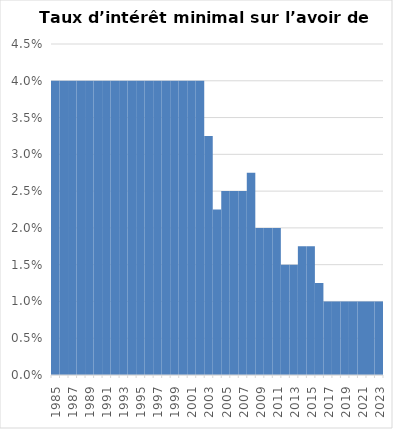
| Category | Taux d’intérêt minimal sur l’avoir de vieillesse |
|---|---|
| 1985.0 | 0.04 |
| 1986.0 | 0.04 |
| 1987.0 | 0.04 |
| 1988.0 | 0.04 |
| 1989.0 | 0.04 |
| 1990.0 | 0.04 |
| 1991.0 | 0.04 |
| 1992.0 | 0.04 |
| 1993.0 | 0.04 |
| 1994.0 | 0.04 |
| 1995.0 | 0.04 |
| 1996.0 | 0.04 |
| 1997.0 | 0.04 |
| 1998.0 | 0.04 |
| 1999.0 | 0.04 |
| 2000.0 | 0.04 |
| 2001.0 | 0.04 |
| 2002.0 | 0.04 |
| 2003.0 | 0.032 |
| 2004.0 | 0.022 |
| 2005.0 | 0.025 |
| 2006.0 | 0.025 |
| 2007.0 | 0.025 |
| 2008.0 | 0.028 |
| 2009.0 | 0.02 |
| 2010.0 | 0.02 |
| 2011.0 | 0.02 |
| 2012.0 | 0.015 |
| 2013.0 | 0.015 |
| 2014.0 | 0.018 |
| 2015.0 | 0.018 |
| 2016.0 | 0.012 |
| 2017.0 | 0.01 |
| 2018.0 | 0.01 |
| 2019.0 | 0.01 |
| 2020.0 | 0.01 |
| 2021.0 | 0.01 |
| 2022.0 | 0.01 |
| 2023.0 | 0.01 |